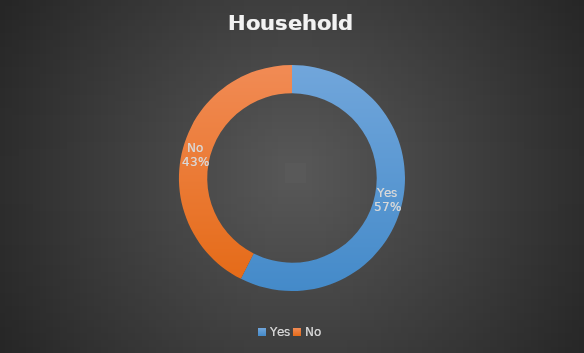
| Category | Series 0 |
|---|---|
| Yes | 0.575 |
| No | 0.425 |